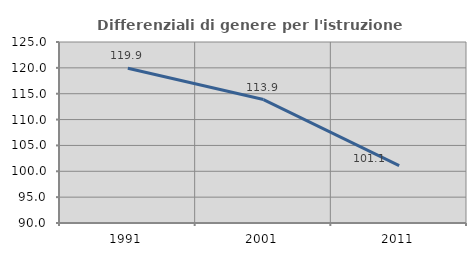
| Category | Differenziali di genere per l'istruzione superiore |
|---|---|
| 1991.0 | 119.925 |
| 2001.0 | 113.872 |
| 2011.0 | 101.109 |